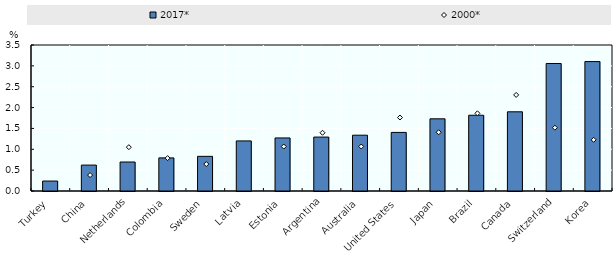
| Category | 2017* |
|---|---|
| Turkey | 0.239 |
| China | 0.621 |
| Netherlands | 0.695 |
| Colombia | 0.794 |
| Sweden | 0.831 |
| Latvia | 1.2 |
| Estonia | 1.272 |
| Argentina | 1.293 |
| Australia | 1.338 |
| United States | 1.404 |
| Japan | 1.73 |
| Brazil | 1.816 |
| Canada | 1.898 |
| Switzerland | 3.057 |
| Korea | 3.103 |